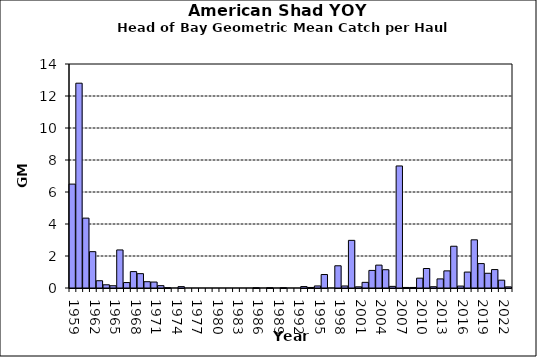
| Category | Series 0 |
|---|---|
| 1959.0 | 6.493 |
| 1960.0 | 12.8 |
| 1961.0 | 4.366 |
| 1962.0 | 2.271 |
| 1963.0 | 0.455 |
| 1964.0 | 0.201 |
| 1965.0 | 0.141 |
| 1966.0 | 2.379 |
| 1967.0 | 0.341 |
| 1968.0 | 1.025 |
| 1969.0 | 0.897 |
| 1970.0 | 0.394 |
| 1971.0 | 0.373 |
| 1972.0 | 0.147 |
| 1973.0 | 0.017 |
| 1974.0 | 0 |
| 1975.0 | 0.087 |
| 1976.0 | 0 |
| 1977.0 | 0 |
| 1978.0 | 0 |
| 1979.0 | 0 |
| 1980.0 | 0 |
| 1981.0 | 0 |
| 1982.0 | 0 |
| 1983.0 | 0 |
| 1984.0 | 0 |
| 1985.0 | 0 |
| 1986.0 | 0.017 |
| 1987.0 | 0 |
| 1988.0 | 0.017 |
| 1989.0 | 0 |
| 1990.0 | 0.017 |
| 1991.0 | 0 |
| 1992.0 | 0 |
| 1993.0 | 0.089 |
| 1994.0 | 0.034 |
| 1995.0 | 0.128 |
| 1996.0 | 0.842 |
| 1997.0 | 0 |
| 1998.0 | 1.389 |
| 1999.0 | 0.127 |
| 2000.0 | 2.978 |
| 2001.0 | 0.074 |
| 2002.0 | 0.353 |
| 2003.0 | 1.1 |
| 2004.0 | 1.43 |
| 2005.0 | 1.143 |
| 2006.0 | 0.102 |
| 2007.0 | 7.627 |
| 2008.0 | 0.034 |
| 2009.0 | 0.034 |
| 2010.0 | 0.614 |
| 2011.0 | 1.219 |
| 2012.0 | 0.08 |
| 2013.0 | 0.569 |
| 2014.0 | 1.071 |
| 2015.0 | 2.61 |
| 2016.0 | 0.121 |
| 2017.0 | 0.996 |
| 2018.0 | 3.011 |
| 2019.0 | 1.526 |
| 2020.0 | 0.92 |
| 2021.0 | 1.152 |
| 2022.0 | 0.49 |
| 2023.0 | 0.071 |